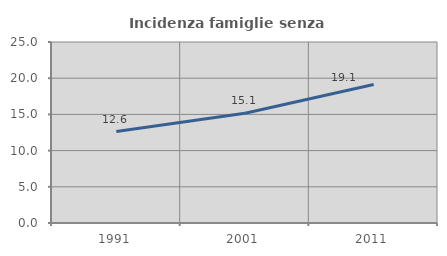
| Category | Incidenza famiglie senza nuclei |
|---|---|
| 1991.0 | 12.636 |
| 2001.0 | 15.15 |
| 2011.0 | 19.129 |